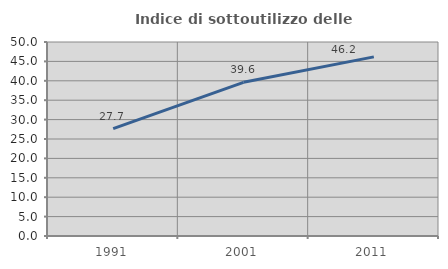
| Category | Indice di sottoutilizzo delle abitazioni  |
|---|---|
| 1991.0 | 27.696 |
| 2001.0 | 39.605 |
| 2011.0 | 46.163 |